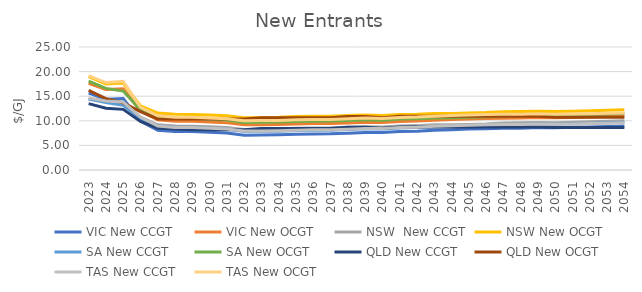
| Category | VIC | NSW  | NSW | SA | QLD | TAS |
|---|---|---|---|---|---|---|
| 2023.0 | 17.608 | 14.541 | 18.962 | 18.058 | 16.202 | 19.167 |
| 2024.0 | 16.368 | 14.002 | 17.502 | 16.591 | 14.494 | 17.778 |
| 2025.0 | 16.532 | 13.723 | 17.687 | 16.044 | 13.641 | 18.032 |
| 2026.0 | 11.96 | 10.737 | 13.021 | 12.217 | 11.886 | 12.747 |
| 2027.0 | 10.193 | 9.183 | 11.579 | 10.778 | 10.376 | 11.02 |
| 2028.0 | 9.912 | 8.949 | 11.344 | 10.545 | 10.383 | 10.74 |
| 2029.0 | 9.905 | 8.899 | 11.292 | 10.504 | 10.375 | 10.732 |
| 2030.0 | 9.749 | 8.771 | 11.163 | 10.337 | 10.376 | 10.576 |
| 2031.0 | 9.601 | 8.638 | 11.029 | 10.162 | 10.371 | 10.428 |
| 2032.0 | 9.187 | 8.24 | 10.629 | 9.671 | 10.355 | 10.014 |
| 2033.0 | 9.21 | 8.284 | 10.672 | 9.694 | 10.611 | 10.037 |
| 2034.0 | 9.248 | 8.318 | 10.705 | 9.732 | 10.614 | 10.075 |
| 2035.0 | 9.361 | 8.464 | 10.85 | 9.845 | 10.618 | 10.188 |
| 2036.0 | 9.437 | 8.54 | 10.924 | 9.921 | 10.619 | 10.264 |
| 2037.0 | 9.457 | 8.565 | 10.947 | 9.941 | 10.635 | 10.284 |
| 2038.0 | 9.571 | 8.678 | 11.059 | 10.055 | 10.88 | 10.398 |
| 2039.0 | 9.72 | 8.808 | 11.187 | 10.204 | 10.899 | 10.547 |
| 2040.0 | 9.653 | 8.757 | 11.079 | 10.125 | 10.645 | 10.46 |
| 2041.0 | 9.868 | 8.96 | 11.28 | 10.341 | 10.908 | 10.676 |
| 2042.0 | 9.942 | 9.02 | 11.338 | 10.414 | 10.909 | 10.749 |
| 2043.0 | 10.119 | 9.175 | 11.492 | 10.585 | 10.908 | 10.927 |
| 2044.0 | 10.246 | 9.173 | 11.49 | 10.62 | 10.908 | 11.054 |
| 2045.0 | 10.362 | 9.27 | 11.585 | 10.736 | 10.905 | 11.17 |
| 2046.0 | 10.458 | 9.359 | 11.673 | 10.831 | 10.905 | 11.265 |
| 2047.0 | 10.533 | 9.533 | 11.841 | 10.978 | 10.904 | 11.317 |
| 2048.0 | 10.55 | 9.592 | 11.893 | 11.023 | 10.904 | 11.314 |
| 2049.0 | 10.671 | 9.658 | 11.953 | 11.118 | 10.906 | 11.409 |
| 2050.0 | 10.6 | 9.616 | 11.872 | 11.057 | 10.746 | 11.314 |
| 2051.0 | 10.687 | 9.715 | 11.966 | 11.158 | 10.746 | 11.386 |
| 2052.0 | 10.774 | 9.816 | 12.061 | 11.261 | 10.745 | 11.458 |
| 2053.0 | 10.861 | 9.917 | 12.157 | 11.365 | 10.745 | 11.531 |
| 2054.0 | 10.95 | 10.02 | 12.254 | 11.47 | 10.745 | 11.604 |